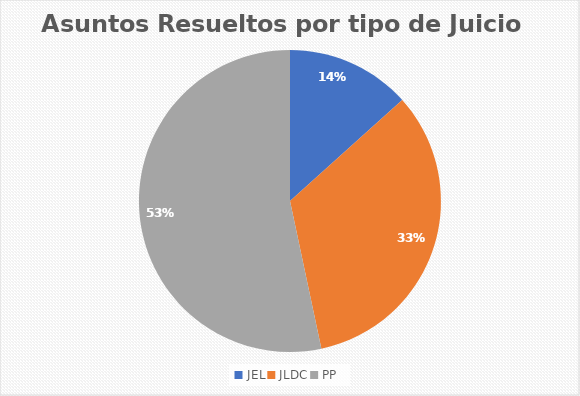
| Category | Rubro Cantidad |
|---|---|
| JEL | 2 |
| JLDC | 5 |
| PP | 8 |